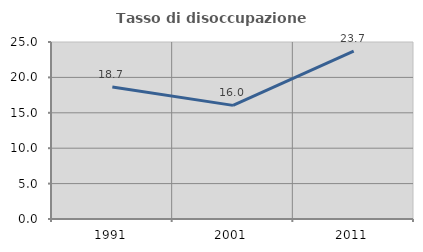
| Category | Tasso di disoccupazione giovanile  |
|---|---|
| 1991.0 | 18.652 |
| 2001.0 | 16.049 |
| 2011.0 | 23.721 |